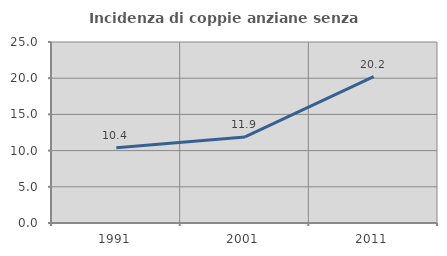
| Category | Incidenza di coppie anziane senza figli  |
|---|---|
| 1991.0 | 10.377 |
| 2001.0 | 11.881 |
| 2011.0 | 20.213 |